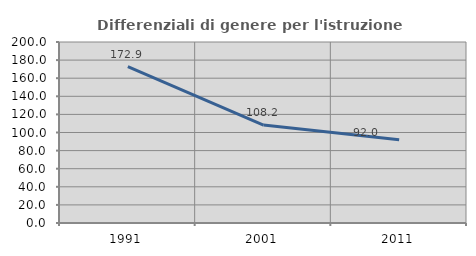
| Category | Differenziali di genere per l'istruzione superiore |
|---|---|
| 1991.0 | 172.917 |
| 2001.0 | 108.182 |
| 2011.0 | 91.954 |